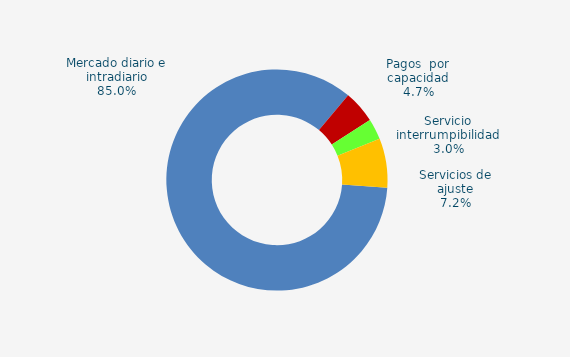
| Category | Series 0 |
|---|---|
| Mercado diario e intradiario | 43.51 |
| Pagos  por capacidad | 2.43 |
| Servicio interrumpibilidad | 1.56 |
| Servicios de ajuste | 3.68 |